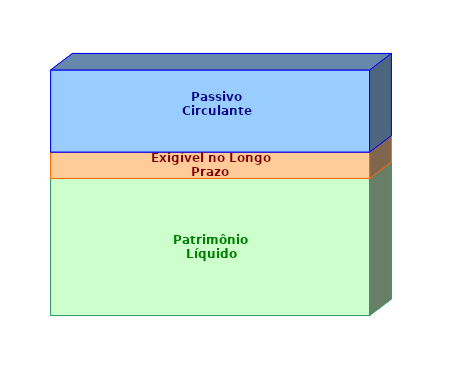
| Category | Patrimônio Líquido | Exigível no Longo Prazo | Passivo Circulante |
|---|---|---|---|
| 0 | 0.558 | 0.108 | 0.334 |